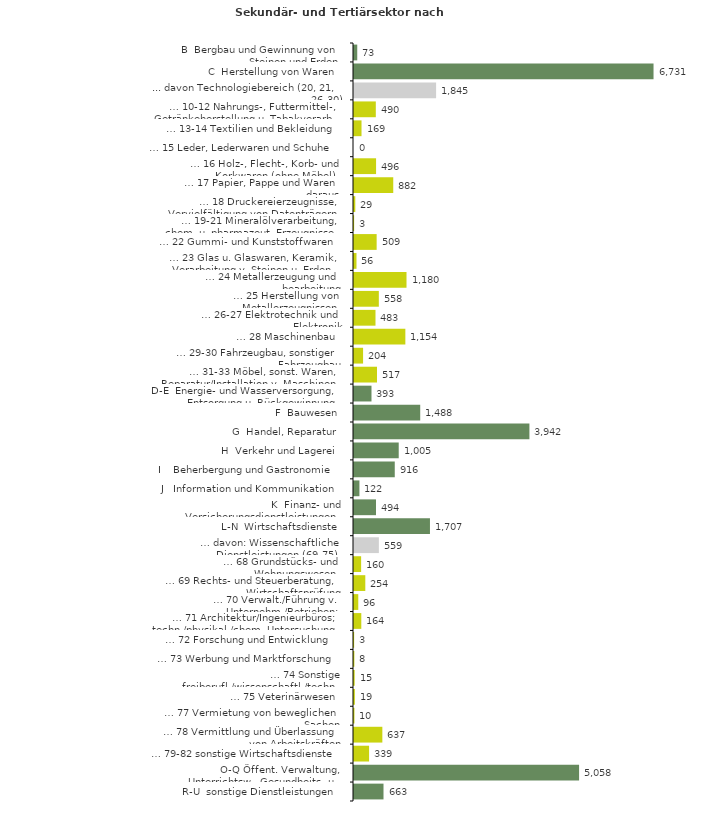
| Category | Series 0 |
|---|---|
| B  Bergbau und Gewinnung von Steinen und Erden | 73 |
| C  Herstellung von Waren | 6731 |
| ... davon Technologiebereich (20, 21, 26-30) | 1845 |
| … 10-12 Nahrungs-, Futtermittel-, Getränkeherstellung u. Tabakverarb. | 490 |
| … 13-14 Textilien und Bekleidung | 169 |
| … 15 Leder, Lederwaren und Schuhe | 0 |
| … 16 Holz-, Flecht-, Korb- und Korkwaren (ohne Möbel)  | 496 |
| … 17 Papier, Pappe und Waren daraus  | 882 |
| … 18 Druckereierzeugnisse, Vervielfältigung von Datenträgern | 29 |
| … 19-21 Mineralölverarbeitung, chem. u. pharmazeut. Erzeugnisse | 3 |
| … 22 Gummi- und Kunststoffwaren | 509 |
| … 23 Glas u. Glaswaren, Keramik, Verarbeitung v. Steinen u. Erden  | 56 |
| … 24 Metallerzeugung und -bearbeitung | 1180 |
| … 25 Herstellung von Metallerzeugnissen  | 558 |
| … 26-27 Elektrotechnik und Elektronik | 483 |
| … 28 Maschinenbau | 1154 |
| … 29-30 Fahrzeugbau, sonstiger Fahrzeugbau | 204 |
| … 31-33 Möbel, sonst. Waren, Reparatur/Installation v. Maschinen | 517 |
| D-E  Energie- und Wasserversorgung, Entsorgung u. Rückgewinnung | 393 |
| F  Bauwesen | 1488 |
| G  Handel, Reparatur | 3942 |
| H  Verkehr und Lagerei | 1005 |
| I    Beherbergung und Gastronomie | 916 |
| J   Information und Kommunikation | 122 |
| K  Finanz- und Versicherungsdienstleistungen | 494 |
| L-N  Wirtschaftsdienste | 1707 |
| … davon: Wissenschaftliche Dienstleistungen (69-75) | 559 |
| … 68 Grundstücks- und Wohnungswesen  | 160 |
| … 69 Rechts- und Steuerberatung, Wirtschaftsprüfung | 254 |
| … 70 Verwalt./Führung v. Unternehm./Betrieben; Unternehmensberat. | 96 |
| … 71 Architektur/Ingenieurbüros; techn./physikal./chem. Untersuchung | 164 |
| … 72 Forschung und Entwicklung  | 3 |
| … 73 Werbung und Marktforschung | 8 |
| … 74 Sonstige freiberufl./wissenschaftl./techn. Tätigkeiten | 15 |
| … 75 Veterinärwesen | 19 |
| … 77 Vermietung von beweglichen Sachen  | 10 |
| … 78 Vermittlung und Überlassung von Arbeitskräften | 637 |
| … 79-82 sonstige Wirtschaftsdienste | 339 |
| O-Q Öffent. Verwaltung, Unterrichtsw., Gesundheits- u. Sozialwesen | 5058 |
| R-U  sonstige Dienstleistungen | 663 |